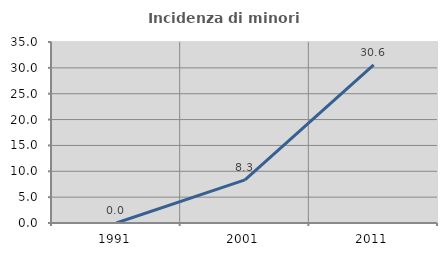
| Category | Incidenza di minori stranieri |
|---|---|
| 1991.0 | 0 |
| 2001.0 | 8.333 |
| 2011.0 | 30.556 |